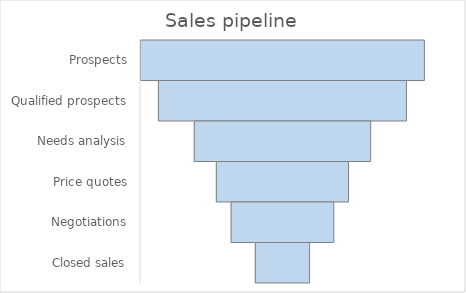
| Category | Spacer (to center bars) | Amount |
|---|---|---|
| Prospects | 0 | 1350 |
| Qualified prospects | 85 | 1180 |
| Needs analysis | 255 | 840 |
| Price quotes | 360 | 630 |
| Negotiations | 430 | 490 |
| Closed sales | 545 | 260 |